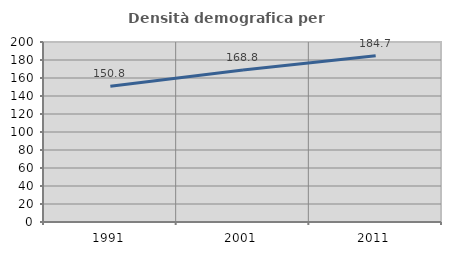
| Category | Densità demografica |
|---|---|
| 1991.0 | 150.788 |
| 2001.0 | 168.796 |
| 2011.0 | 184.71 |